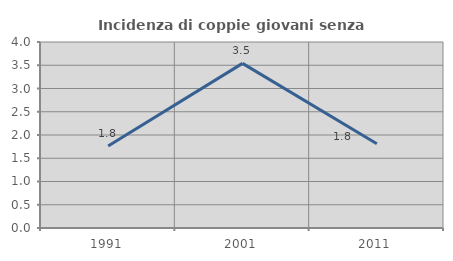
| Category | Incidenza di coppie giovani senza figli |
|---|---|
| 1991.0 | 1.762 |
| 2001.0 | 3.54 |
| 2011.0 | 1.81 |